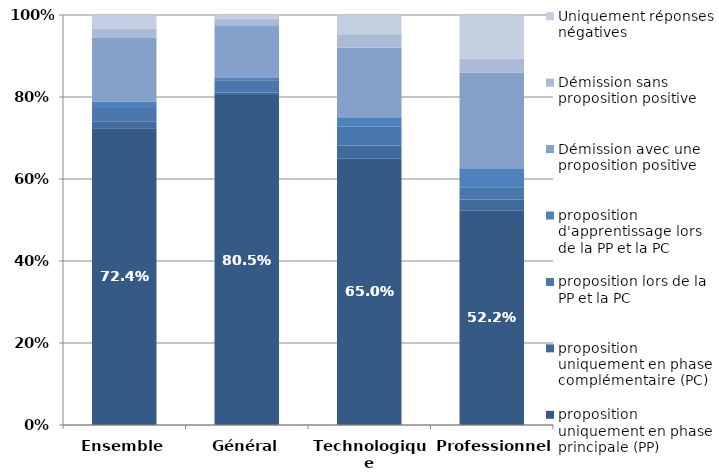
| Category | proposition uniquement en phase principale (PP) | proposition uniquement en phase complémentaire (PC) | proposition lors de la PP et la PC | proposition d'apprentissage lors de la PP et la PC | Démission avec une proposition positive | Démission sans proposition positive | Uniquement réponses négatives |
|---|---|---|---|---|---|---|---|
| Ensemble | 0.724 | 0.016 | 0.033 | 0.016 | 0.155 | 0.023 | 0.033 |
| Général | 0.805 | 0.006 | 0.03 | 0.006 | 0.128 | 0.017 | 0.008 |
| Technologique | 0.65 | 0.032 | 0.046 | 0.023 | 0.169 | 0.032 | 0.047 |
| Professionnel | 0.522 | 0.028 | 0.03 | 0.044 | 0.236 | 0.034 | 0.106 |